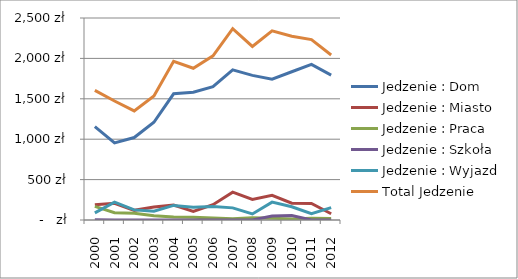
| Category | Jedzenie : Dom | Jedzenie : Miasto | Jedzenie : Praca | Jedzenie : Szkoła | Jedzenie : Wyjazd | Total Jedzenie |
|---|---|---|---|---|---|---|
| 2000 | 1156.023 | 189.248 | 169.053 | 2.092 | 87.758 | 1604.174 |
| 2001 | 954.478 | 206.846 | 91.178 | 0 | 219.993 | 1472.495 |
| 2002 | 1020.368 | 119.419 | 84.672 | 0 | 125.187 | 1349.646 |
| 2003 | 1209.226 | 161.301 | 53.958 | 0 | 109.632 | 1534.116 |
| 2004 | 1561.826 | 183.958 | 38.105 | 0 | 180.573 | 1964.462 |
| 2005 | 1581.515 | 104.947 | 33.562 | 0 | 158.398 | 1878.421 |
| 2006 | 1649.535 | 189.758 | 23.771 | 0 | 168.123 | 2031.187 |
| 2007 | 1857.901 | 344.587 | 15.497 | 0 | 150.138 | 2368.123 |
| 2008 | 1790.128 | 254.821 | 27.907 | 0 | 75.257 | 2148.112 |
| 2009 | 1743.216 | 305.634 | 21.546 | 49.985 | 221.249 | 2341.63 |
| 2010 | 1834.54 | 207.57 | 12.757 | 54.6 | 163.888 | 2273.355 |
| 2011 | 1925.917 | 204.904 | 23.067 | 0 | 78.71 | 2232.598 |
| 2012 | 1793.536 | 77.49 | 18.807 | 0 | 152.94 | 2042.772 |